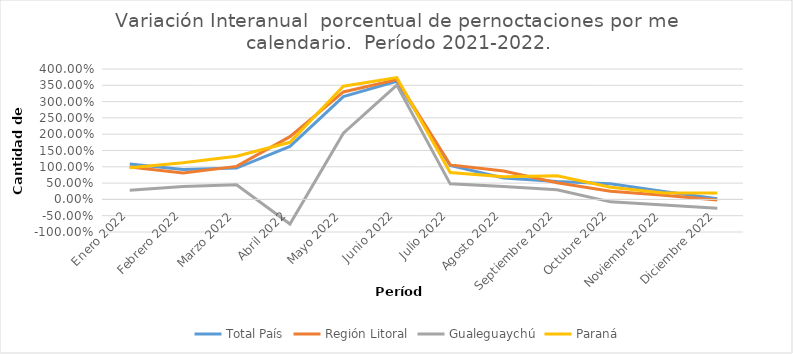
| Category | Total País | Región Litoral | Gualeguaychú | Paraná |
|---|---|---|---|---|
| Enero 2022 | 1.086 | 0.991 | 0.281 | 0.973 |
| Febrero 2022 | 0.917 | 0.809 | 0.399 | 1.124 |
| Marzo 2022 | 0.962 | 1.013 | 0.446 | 1.324 |
| Abril 2022 | 1.625 | 1.925 | -0.755 | 1.752 |
| Mayo 2022 | 3.155 | 3.297 | 2.033 | 3.471 |
| Junio 2022 | 3.622 | 3.673 | 3.508 | 3.738 |
| Julio 2022 | 1.044 | 1.059 | 0.477 | 0.822 |
| Agosto 2022 | 0.658 | 0.871 | 0.398 | 0.693 |
| Septiembre 2022 | 0.55 | 0.513 | 0.295 | 0.728 |
| Octubre 2022 | 0.478 | 0.25 | -0.075 | 0.373 |
| Noviembre 2022 | 0.242 | 0.127 | -0.173 | 0.195 |
| Diciembre 2022 | 0.024 | -0.02 | -0.275 | 0.195 |